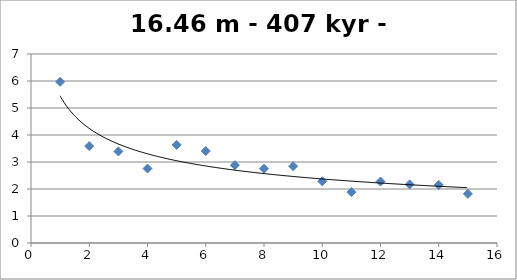
| Category | Series 0 |
|---|---|
| 1.0 | 5.969 |
| 2.0 | 3.589 |
| 3.0 | 3.392 |
| 4.0 | 2.759 |
| 5.0 | 3.634 |
| 6.0 | 3.407 |
| 7.0 | 2.884 |
| 8.0 | 2.753 |
| 9.0 | 2.846 |
| 10.0 | 2.286 |
| 11.0 | 1.885 |
| 12.0 | 2.276 |
| 13.0 | 2.171 |
| 14.0 | 2.149 |
| 15.0 | 1.82 |